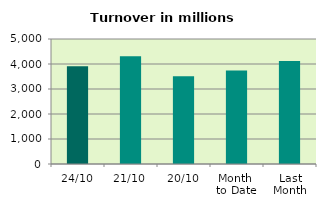
| Category | Series 0 |
|---|---|
| 24/10 | 3910.106 |
| 21/10 | 4308.77 |
| 20/10 | 3514.625 |
| Month 
to Date | 3742.451 |
| Last
Month | 4119.728 |